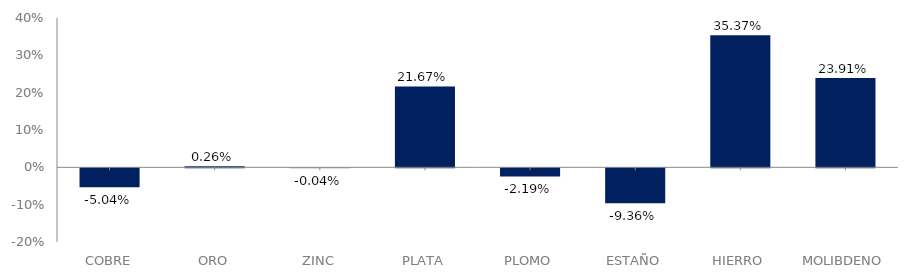
| Category | serie |
|---|---|
| 0 | -0.05 |
| 1 | 0.003 |
| 2 | 0 |
| 3 | 0.217 |
| 4 | -0.022 |
| 5 | -0.094 |
| 6 | 0.354 |
| 7 | 0.239 |